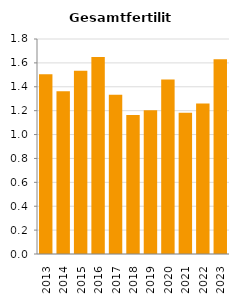
| Category | Gesamtfertilität |
|---|---|
| 2013.0 | 1.504 |
| 2014.0 | 1.363 |
| 2015.0 | 1.534 |
| 2016.0 | 1.649 |
| 2017.0 | 1.334 |
| 2018.0 | 1.164 |
| 2019.0 | 1.204 |
| 2020.0 | 1.46 |
| 2021.0 | 1.182 |
| 2022.0 | 1.26 |
| 2023.0 | 1.631 |